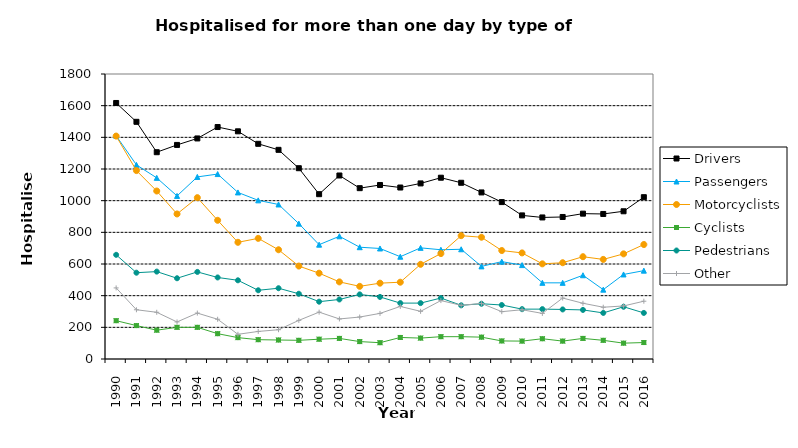
| Category | Drivers | Passengers | Motorcyclists | Cyclists | Pedestrians | Other |
|---|---|---|---|---|---|---|
| 1990.0 | 1617 | 1410 | 1408 | 242 | 658 | 449 |
| 1991.0 | 1498 | 1226 | 1190 | 211 | 545 | 311 |
| 1992.0 | 1306 | 1144 | 1061 | 182 | 552 | 295 |
| 1993.0 | 1352 | 1030 | 916 | 200 | 510 | 234 |
| 1994.0 | 1393 | 1150 | 1019 | 200 | 550 | 290 |
| 1995.0 | 1465 | 1168 | 876 | 160 | 515 | 251 |
| 1996.0 | 1438 | 1052 | 737 | 135 | 497 | 156 |
| 1997.0 | 1359 | 1002 | 762 | 122 | 434 | 174 |
| 1998.0 | 1321 | 976 | 690 | 120 | 447 | 185 |
| 1999.0 | 1205 | 855 | 587 | 118 | 412 | 244 |
| 2000.0 | 1041 | 722 | 542 | 125 | 362 | 296 |
| 2001.0 | 1159 | 775 | 487 | 130 | 376 | 253 |
| 2002.0 | 1079 | 706 | 459 | 110 | 408 | 265 |
| 2003.0 | 1099 | 698 | 479 | 103 | 392 | 288 |
| 2004.0 | 1083 | 646 | 485 | 136 | 353 | 332 |
| 2005.0 | 1109 | 702 | 598 | 132 | 353 | 301 |
| 2006.0 | 1145 | 690 | 666 | 141 | 385 | 369 |
| 2007.0 | 1113 | 693 | 779 | 141 | 339 | 339 |
| 2008.0 | 1052 | 585 | 769 | 138 | 349 | 351 |
| 2009.0 | 991 | 615 | 685 | 114 | 341 | 299 |
| 2010.0 | 907 | 593 | 670 | 113 | 315 | 311 |
| 2011.0 | 894 | 481 | 601 | 128 | 315 | 288 |
| 2012.0 | 897 | 481 | 608 | 113 | 313 | 385 |
| 2013.0 | 918 | 529 | 646 | 130 | 310 | 352 |
| 2014.0 | 916 | 438 | 629 | 118 | 291 | 327 |
| 2015.0 | 933 | 534 | 664 | 100 | 330 | 335 |
| 2016.0 | 1022 | 558 | 723 | 104 | 291 | 365 |